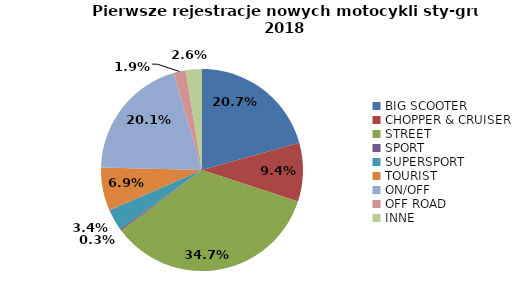
| Category | Series 0 |
|---|---|
| 0 | 2999 |
| 1 | 1367 |
| 2 | 5042 |
| 3 | 43 |
| 4 | 492 |
| 5 | 1009 |
| 6 | 2913 |
| 7 | 281 |
| 8 | 378 |